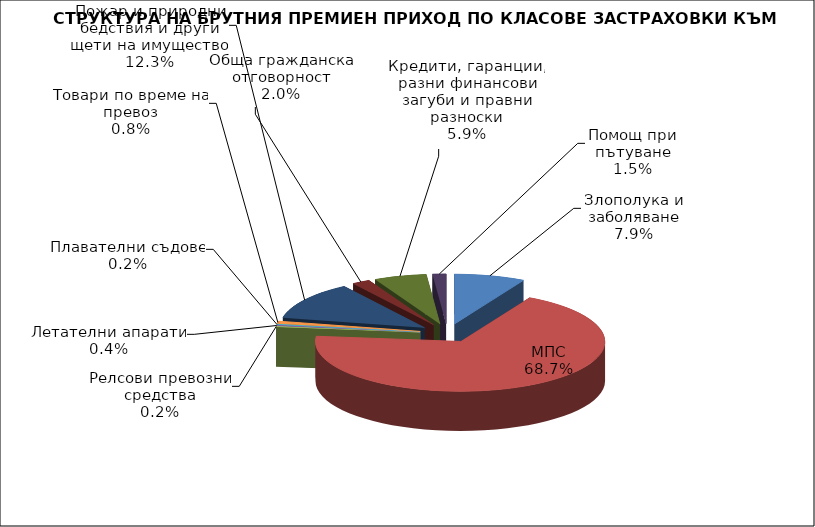
| Category | Злополука и заболяване |
|---|---|
| Злополука и заболяване | 0.079 |
| МПС | 0.687 |
| Релсови превозни средства | 0.002 |
| Летателни апарати | 0.004 |
| Плавателни съдове | 0.002 |
| Товари по време на превоз | 0.008 |
| Пожар и природни бедствия и други щети на имущество | 0.123 |
| Обща гражданска отговорност | 0.02 |
| Кредити, гаранции, разни финансови загуби и правни разноски | 0.059 |
| Помощ при пътуване | 0.015 |